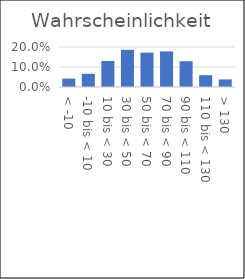
| Category | Wahrsch. |
|---|---|
| < -10 | 0.042 |
| -10 bis < 10 | 0.066 |
| 10 bis < 30 | 0.13 |
| 30 bis < 50 | 0.186 |
| 50 bis < 70 | 0.172 |
| 70 bis < 90 | 0.178 |
| 90 bis < 110 | 0.129 |
| 110 bis < 130 | 0.059 |
| > 130 | 0.038 |